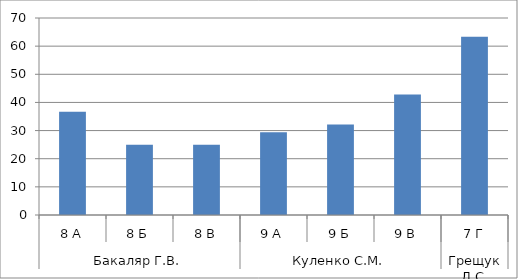
| Category | Series 0 |
|---|---|
| 0 | 36.667 |
| 1 | 25 |
| 2 | 25 |
| 3 | 29.412 |
| 4 | 32.143 |
| 5 | 42.857 |
| 6 | 63.333 |